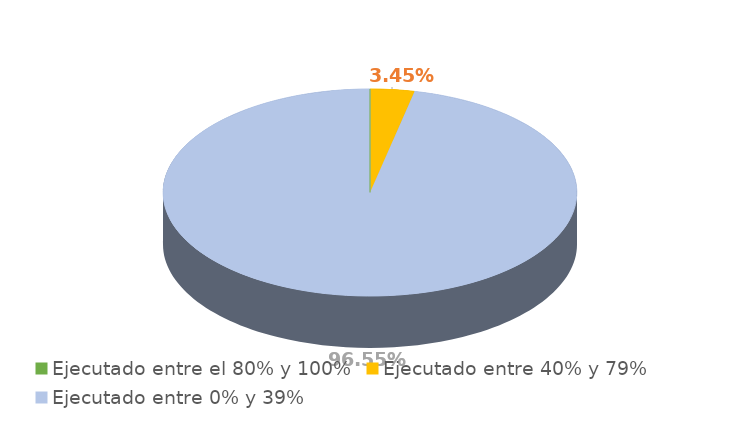
| Category | Series 0 |
|---|---|
| Ejecutado entre el 80% y 100% | 0 |
| Ejecutado entre 40% y 79% | 0.034 |
| Ejecutado entre 0% y 39% | 0.966 |